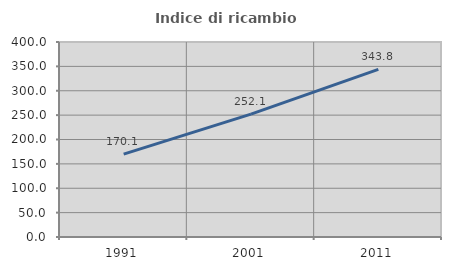
| Category | Indice di ricambio occupazionale  |
|---|---|
| 1991.0 | 170.051 |
| 2001.0 | 252.062 |
| 2011.0 | 343.784 |